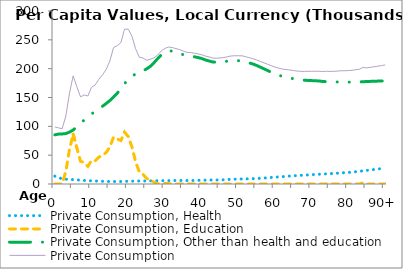
| Category | Private Consumption, Health | Private Consumption, Education | Private Consumption, Other than health and education | Private Consumption |
|---|---|---|---|---|
| 0 | 13648.734 | 0 | 85294.759 | 98943.492 |
|  | 10849.529 | 0 | 86529.401 | 97378.929 |
| 2 | 9167.319 | 0 | 86796.68 | 95963.999 |
| 3 | 8290.638 | 22136.937 | 87504.319 | 117931.895 |
| 4 | 7959.992 | 59980.704 | 89971.842 | 157912.538 |
| 5 | 7610.52 | 86176.979 | 93685.821 | 187473.319 |
| 6 | 7176.895 | 62493.709 | 98993.887 | 168664.491 |
| 7 | 6663.16 | 39349.025 | 105028.26 | 151040.446 |
| 8 | 6135.886 | 37378.57 | 110972.317 | 154486.773 |
| 9 | 5738.02 | 30544.296 | 116334.081 | 152616.397 |
| 10 | 5494.39 | 40761.38 | 121427.418 | 167683.187 |
| 11 | 5235.641 | 40437.185 | 126095.861 | 171768.688 |
| 12 | 4961.973 | 46625.13 | 130161.162 | 181748.265 |
| 13 | 4701.213 | 49776.111 | 134843.104 | 189320.428 |
| 14 | 4483.106 | 54704.31 | 139656.455 | 198843.871 |
| 15 | 4355.214 | 64391.142 | 144768.389 | 213514.746 |
| 16 | 4310.319 | 81409.357 | 151012.79 | 236732.465 |
| 17 | 4284.967 | 78084.768 | 157317.945 | 239687.68 |
| 18 | 4340.95 | 75291.74 | 165452.674 | 245085.364 |
| 19 | 4452.934 | 90052.2 | 174026.956 | 268532.091 |
| 20 | 4656.634 | 82247.25 | 181565.828 | 268469.712 |
| 21 | 4914.126 | 64317.311 | 187157.163 | 256388.6 |
| 22 | 5086.592 | 38856.748 | 190629.261 | 234572.601 |
| 23 | 5192.623 | 21049.855 | 193729.691 | 219972.169 |
| 24 | 5216.72 | 16928.329 | 196422.505 | 218567.555 |
| 25 | 5248.266 | 9666.458 | 199553.008 | 214467.732 |
| 26 | 5351.141 | 7006.14 | 203970.566 | 216327.848 |
| 27 | 5499.48 | 3110.765 | 210195.323 | 218805.568 |
| 28 | 5643.578 | 489.507 | 217324.979 | 223458.063 |
| 29 | 5818.663 | 1052.513 | 223862.083 | 230733.259 |
| 30 | 5881.03 | 666.937 | 228539.685 | 235087.652 |
| 31 | 5927.933 | 716.836 | 230861.354 | 237506.123 |
| 32 | 6031.558 | 120.202 | 230461.636 | 236613.396 |
| 33 | 6076.12 | 0 | 228741.34 | 234817.459 |
| 34 | 6071.502 | 0 | 226933.356 | 233004.858 |
| 35 | 5983.008 | 187.166 | 224165.673 | 230335.847 |
| 36 | 6003.377 | 51.412 | 222191.235 | 228246.024 |
| 37 | 6125.095 | 0 | 221737.436 | 227862.53 |
| 38 | 6194.837 | 0 | 220641.943 | 226836.78 |
| 39 | 6343.115 | 0 | 219279.461 | 225622.576 |
| 40 | 6441.364 | 0 | 217708.212 | 224149.575 |
| 41 | 6692.439 | 16.116 | 215183.812 | 221892.367 |
| 42 | 6899.902 | 209.298 | 213387.716 | 220496.916 |
| 43 | 6933.455 | 0 | 211584.307 | 218517.762 |
| 44 | 6991.669 | 0 | 211129.679 | 218121.348 |
| 45 | 7089.155 | 0 | 211552.671 | 218641.826 |
| 46 | 7295.17 | 0 | 211897.416 | 219192.586 |
| 47 | 7687.126 | 0 | 213011.338 | 220698.464 |
| 48 | 8082.984 | 0 | 213918.556 | 222001.54 |
| 49 | 8361.651 | 0 | 214035.564 | 222397.215 |
| 50 | 8565.446 | 0 | 213827.699 | 222393.144 |
| 51 | 8729.431 | 0 | 213571.213 | 222300.645 |
| 52 | 8901.13 | 0 | 211786.43 | 220687.56 |
| 53 | 9033.756 | 0 | 209911.043 | 218944.799 |
| 54 | 9244.718 | 0 | 208003.919 | 217248.637 |
| 55 | 9557.948 | 0 | 205518.151 | 215076.099 |
| 56 | 9898.145 | 0 | 202573.933 | 212472.079 |
| 57 | 10325.818 | 0 | 199713.332 | 210039.15 |
| 58 | 10843.316 | 0 | 196695.926 | 207539.242 |
| 59 | 11360.67 | 0 | 193649.372 | 205010.042 |
| 60 | 11833.217 | 0 | 190992.123 | 202825.34 |
| 61 | 12285.724 | 3.176 | 188604.262 | 200893.162 |
| 62 | 12734.862 | 0 | 186621.345 | 199356.207 |
| 63 | 13261.477 | 0 | 185163.112 | 198424.589 |
| 64 | 13810.2 | 0 | 183931.18 | 197741.38 |
| 65 | 14257.071 | 0 | 182506.544 | 196763.615 |
| 66 | 14612.209 | 0 | 181276.313 | 195888.522 |
| 67 | 14949.445 | 0 | 180367.16 | 195316.605 |
| 68 | 15334.789 | 0 | 179939.701 | 195274.49 |
| 69 | 15785.827 | 133.876 | 179572.309 | 195492.012 |
| 70 | 16122.603 | 0 | 179298.027 | 195420.631 |
| 71 | 16508.342 | 0 | 179024.841 | 195533.183 |
| 72 | 16928.167 | 0 | 178605.601 | 195533.768 |
| 73 | 17240.361 | 0 | 177825.815 | 195066.177 |
| 74 | 17659.358 | 313 | 177471.756 | 195444.115 |
| 75 | 17951.552 | 0 | 177311.639 | 195263.191 |
| 76 | 18338.036 | 0 | 177072.647 | 195410.683 |
| 77 | 18758.885 | 0 | 176930.283 | 195689.167 |
| 78 | 19206.497 | 308.742 | 176912.985 | 196428.224 |
| 79 | 19631.551 | 0 | 176741.004 | 196372.555 |
| 80 | 20046.373 | 0 | 176672.756 | 196719.129 |
| 81 | 20585.553 | 0 | 176632.983 | 197218.536 |
| 82 | 21292.768 | 0 | 176778.879 | 198071.647 |
| 83 | 22040.209 | 0 | 177021.659 | 199061.868 |
| 84 | 22810.845 | 2059.873 | 177382.708 | 202253.426 |
| 85 | 23604.321 | 0 | 177687.463 | 201291.784 |
| 86 | 24386.993 | 0 | 177962.525 | 202349.518 |
| 87 | 25160.305 | 0 | 178206.72 | 203367.025 |
| 88 | 25929.861 | 0 | 178423.523 | 204353.384 |
| 89 | 26703.572 | 0 | 178627.014 | 205330.585 |
| 90+ | 27521.063 | 0 | 178831.232 | 206352.295 |